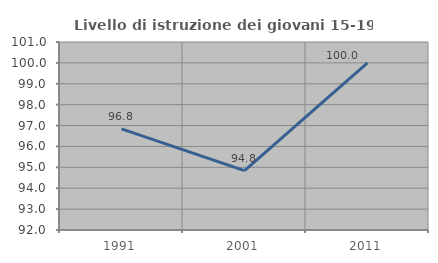
| Category | Livello di istruzione dei giovani 15-19 anni |
|---|---|
| 1991.0 | 96.842 |
| 2001.0 | 94.845 |
| 2011.0 | 100 |